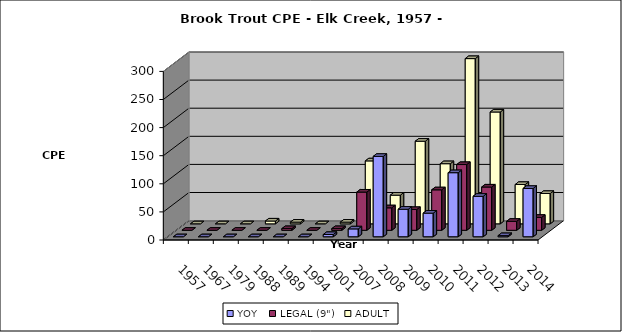
| Category | YOY | LEGAL (9") | ADULT |
|---|---|---|---|
| 1957.0 | 0 | 0 | 0 |
| 1967.0 | 0 | 0 | 0 |
| 1979.0 | 0 | 0 | 0 |
| 1988.0 | 0 | 0 | 5 |
| 1989.0 | 0 | 3 | 3 |
| 1994.0 | 0 | 0 | 0 |
| 2001.0 | 4 | 3 | 3 |
| 2007.0 | 14 | 68 | 112 |
| 2008.0 | 143 | 40 | 51 |
| 2009.0 | 49 | 37 | 147 |
| 2010.0 | 42 | 72 | 107 |
| 2011.0 | 114 | 117 | 294 |
| 2012.0 | 72 | 77 | 199 |
| 2013.0 | 2 | 16 | 70 |
| 2014.0 | 86 | 23 | 54 |